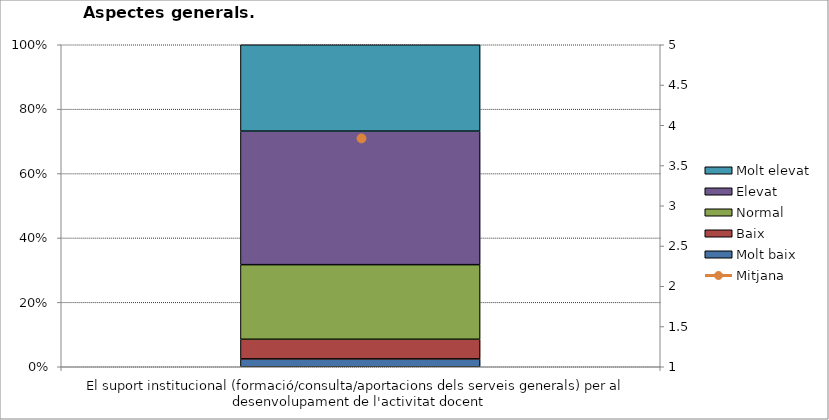
| Category | Molt baix | Baix | Normal  | Elevat | Molt elevat |
|---|---|---|---|---|---|
| El suport institucional (formació/consulta/aportacions dels serveis generals) per al desenvolupament de l'activitat docent | 2 | 5 | 19 | 34 | 22 |